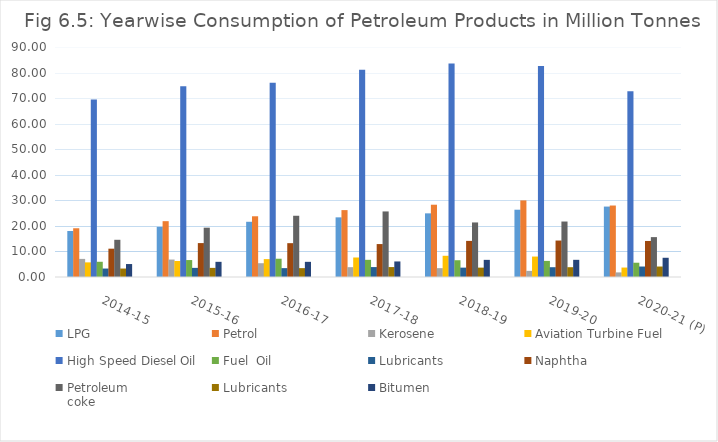
| Category | LPG | Petrol | Kerosene | Aviation Turbine Fuel | High Speed Diesel Oil | Fuel  Oil | Lubricants | Naphtha | Petroleum
coke | Bitumen |
|---|---|---|---|---|---|---|---|---|---|---|
| 2014-15 | 18 | 19.075 | 7.087 | 5.723 | 69.416 | 5.961 | 3.31 | 11.082 | 14.557 | 5.073 |
| 2015-16 | 19.623 | 21.847 | 6.826 | 6.262 | 74.647 | 6.632 | 3.571 | 13.271 | 19.297 | 5.938 |
| 2016-17 | 21.608 | 23.765 | 5.397 | 6.998 | 76.027 | 7.15 | 3.47 | 13.241 | 23.964 | 5.936 |
| 2017-18 | 23.342 | 26.174 | 3.845 | 7.633 | 81.073 | 6.721 | 3.884 | 12.889 | 25.657 | 6.086 |
| 2018-19 | 24.907 | 28.284 | 3.459 | 8.3 | 83.528 | 6.564 | 3.668 | 14.131 | 21.346 | 6.708 |
| 2019-20 | 26.33 | 29.975 | 2.397 | 7.999 | 82.602 | 6.302 | 3.833 | 14.268 | 21.708 | 6.72 |
| 2020-21 (P) | 27.558 | 27.969 | 1.798 | 3.698 | 72.713 | 5.586 | 4.097 | 14.1 | 15.605 | 7.524 |